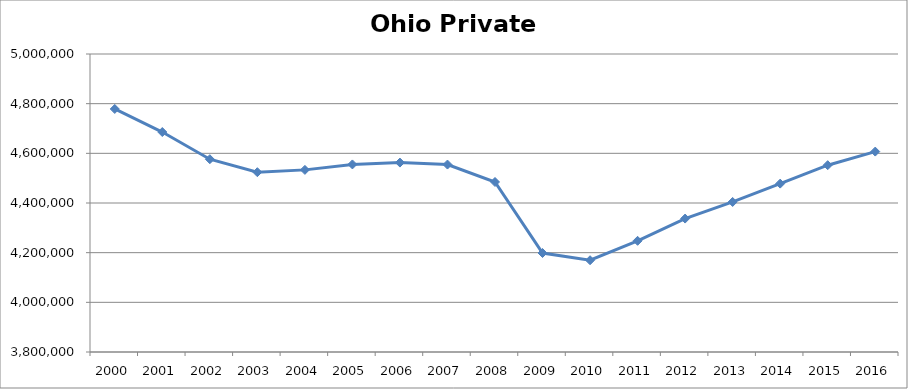
| Category | Ohio |
|---|---|
| 2000 | 4778653 |
| 2001 | 4685732 |
| 2002 | 4576369 |
| 2003 | 4524065 |
| 2004 | 4533380 |
| 2005 | 4555293 |
| 2006 | 4562713 |
| 2007 | 4554818 |
| 2008 | 4484625 |
| 2009 | 4198597 |
| 2010 | 4169532 |
| 2011 | 4247686 |
| 2012 | 4337301 |
| 2013 | 4404185 |
| 2014 | 4478047 |
| 2015 | 4552282 |
| 2016 | 4607033 |